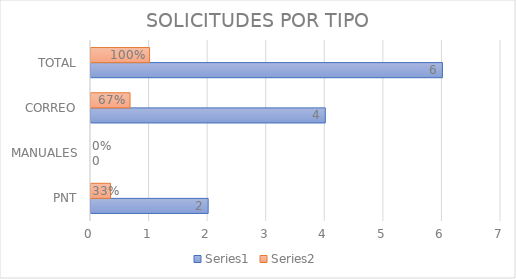
| Category | Series 0 | Series 1 |
|---|---|---|
| PNT | 2 | 0.333 |
| MANUALES | 0 | 0 |
| CORREO | 4 | 0.667 |
| TOTAL | 6 | 1 |